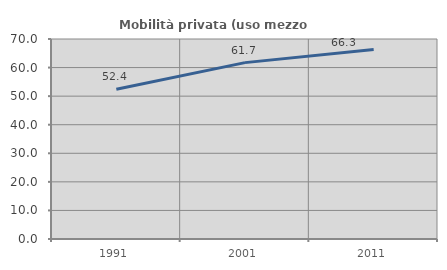
| Category | Mobilità privata (uso mezzo privato) |
|---|---|
| 1991.0 | 52.444 |
| 2001.0 | 61.731 |
| 2011.0 | 66.334 |